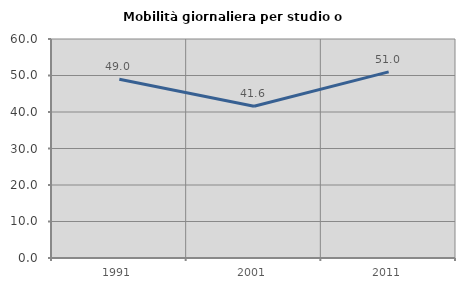
| Category | Mobilità giornaliera per studio o lavoro |
|---|---|
| 1991.0 | 48.967 |
| 2001.0 | 41.575 |
| 2011.0 | 51 |